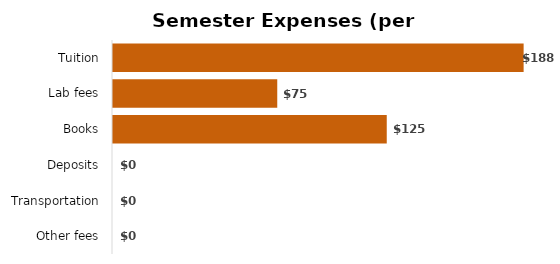
| Category | Series 0 |
|---|---|
| Tuition | 187.5 |
| Lab fees | 75 |
| Books | 125 |
| Deposits | 0 |
| Transportation | 0 |
| Other fees | 0 |